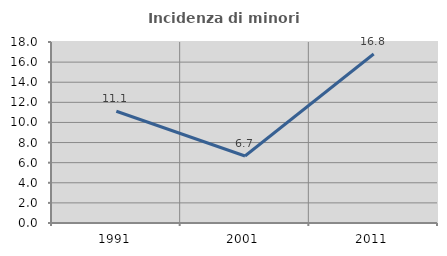
| Category | Incidenza di minori stranieri |
|---|---|
| 1991.0 | 11.111 |
| 2001.0 | 6.667 |
| 2011.0 | 16.802 |